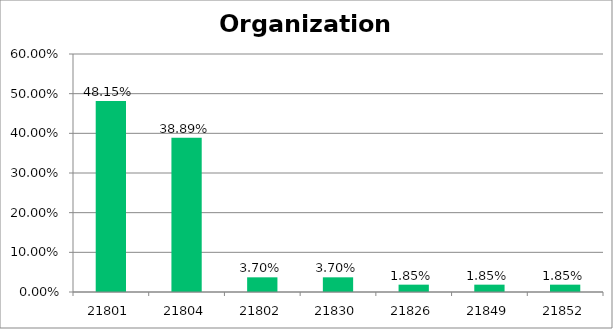
| Category | Responses |
|---|---|
| 21801 | 0.482 |
| 21804 | 0.389 |
| 21802 | 0.037 |
| 21830 | 0.037 |
| 21826 | 0.018 |
| 21849 | 0.018 |
| 21852 | 0.018 |